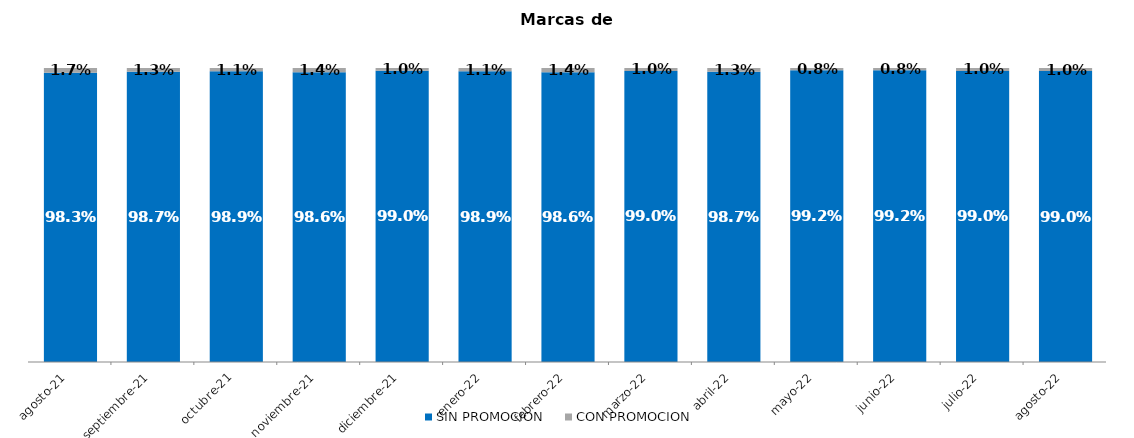
| Category | SIN PROMOCION   | CON PROMOCION   |
|---|---|---|
| 2021-08-01 | 0.983 | 0.017 |
| 2021-09-01 | 0.987 | 0.013 |
| 2021-10-01 | 0.989 | 0.011 |
| 2021-11-01 | 0.986 | 0.014 |
| 2021-12-01 | 0.99 | 0.01 |
| 2022-01-01 | 0.989 | 0.011 |
| 2022-02-01 | 0.986 | 0.014 |
| 2022-03-01 | 0.99 | 0.01 |
| 2022-04-01 | 0.987 | 0.013 |
| 2022-05-01 | 0.992 | 0.008 |
| 2022-06-01 | 0.992 | 0.008 |
| 2022-07-01 | 0.99 | 0.01 |
| 2022-08-01 | 0.99 | 0.01 |